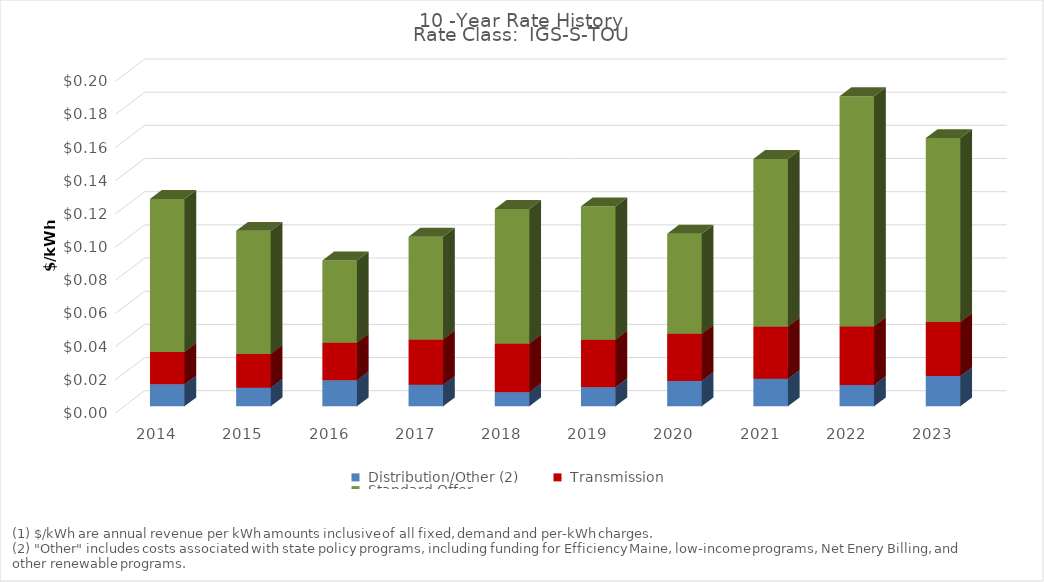
| Category | Series 1 | Series 2 | Series 3 |
|---|---|---|---|
| 2014.0 | 0.013 | 0.019 | 0.092 |
| 2015.0 | 0.011 | 0.02 | 0.074 |
| 2016.0 | 0.016 | 0.023 | 0.05 |
| 2017.0 | 0.013 | 0.027 | 0.062 |
| 2018.0 | 0.009 | 0.029 | 0.081 |
| 2019.0 | 0.011 | 0.029 | 0.08 |
| 2020.0 | 0.015 | 0.028 | 0.06 |
| 2021.0 | 0.017 | 0.031 | 0.101 |
| 2022.0 | 0.013 | 0.035 | 0.139 |
| 2023.0 | 0.018 | 0.033 | 0.111 |